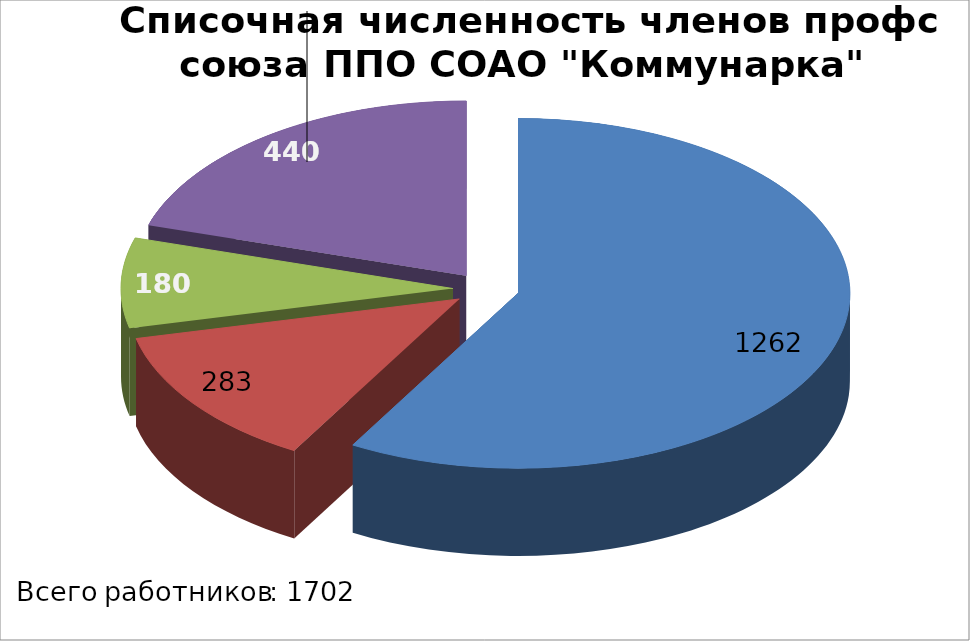
| Category | Series 0 |
|---|---|
| женщины | 1262 |
| молодежь | 283 |
| пенсионеры | 180 |
| мужчины | 440 |